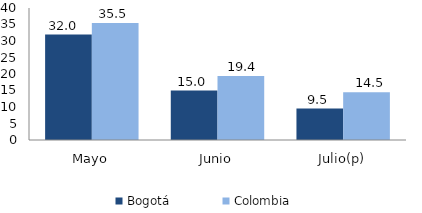
| Category | Bogotá | Colombia |
|---|---|---|
| Mayo | 31.954 | 35.482 |
| Junio | 14.975 | 19.38 |
| Julio(p) | 9.543 | 14.456 |